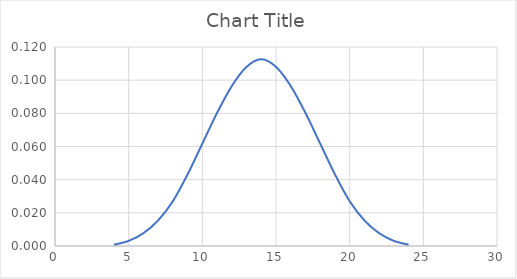
| Category | Series 0 |
|---|---|
| 4.0 | 0.001 |
| 5.0 | 0.003 |
| 6.0 | 0.008 |
| 7.0 | 0.015 |
| 8.0 | 0.027 |
| 9.0 | 0.043 |
| 10.0 | 0.062 |
| 11.0 | 0.08 |
| 12.0 | 0.096 |
| 13.0 | 0.108 |
| 14.0 | 0.113 |
| 15.0 | 0.108 |
| 16.0 | 0.096 |
| 17.0 | 0.08 |
| 18.0 | 0.062 |
| 19.0 | 0.043 |
| 20.0 | 0.027 |
| 21.0 | 0.015 |
| 22.0 | 0.008 |
| 23.0 | 0.003 |
| 24.0 | 0.001 |